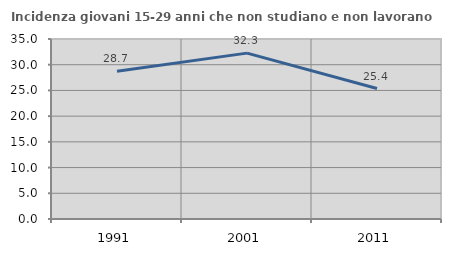
| Category | Incidenza giovani 15-29 anni che non studiano e non lavorano  |
|---|---|
| 1991.0 | 28.737 |
| 2001.0 | 32.252 |
| 2011.0 | 25.368 |